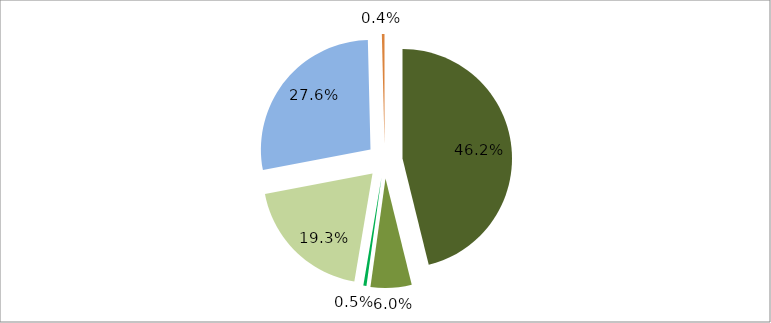
| Category | Series 0 |
|---|---|
| 0 | 0.462 |
| 1 | 0.06 |
| 2 | 0.005 |
| 3 | 0.193 |
| 4 | 0.276 |
| 5 | 0.004 |